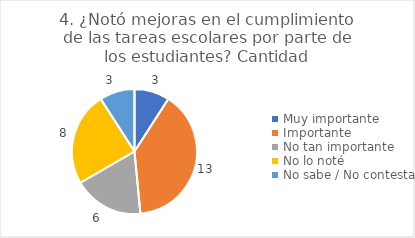
| Category | 4. ¿Notó mejoras en el cumplimiento de las tareas escolares por parte de los estudiantes? |
|---|---|
| Muy importante  | 0.091 |
| Importante  | 0.394 |
| No tan importante  | 0.182 |
| No lo noté  | 0.242 |
| No sabe / No contesta | 0.091 |